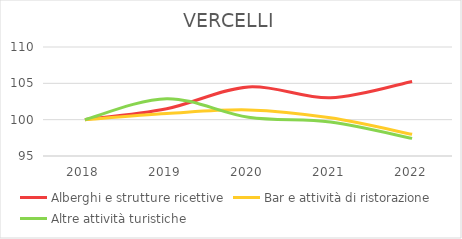
| Category | Alberghi e strutture ricettive | Bar e attività di ristorazione | Altre attività turistiche |
|---|---|---|---|
| 2018.0 | 100 | 100 | 100 |
| 2019.0 | 101.504 | 100.84 | 102.894 |
| 2020.0 | 104.511 | 101.343 | 100.322 |
| 2021.0 | 103.008 | 100.252 | 99.678 |
| 2022.0 | 105.263 | 97.985 | 97.428 |